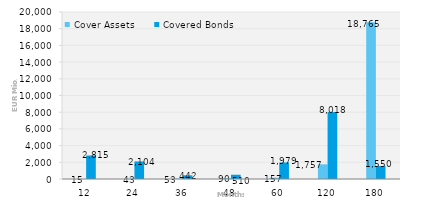
| Category | Cover Assets | Covered Bonds |
|---|---|---|
| 12.0 | 14.502 | 2815.286 |
| 24.0 | 42.501 | 2103.5 |
| 36.0 | 52.865 | 441.5 |
| 48.0 | 89.504 | 510 |
| 60.0 | 156.954 | 1978.646 |
| 120.0 | 1756.991 | 8017.626 |
| 180.0 | 18765.465 | 1550 |